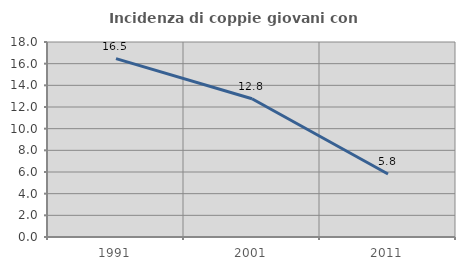
| Category | Incidenza di coppie giovani con figli |
|---|---|
| 1991.0 | 16.466 |
| 2001.0 | 12.766 |
| 2011.0 | 5.818 |